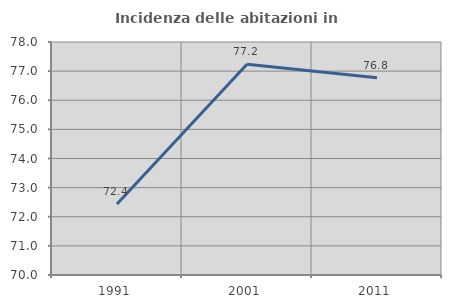
| Category | Incidenza delle abitazioni in proprietà  |
|---|---|
| 1991.0 | 72.435 |
| 2001.0 | 77.238 |
| 2011.0 | 76.771 |